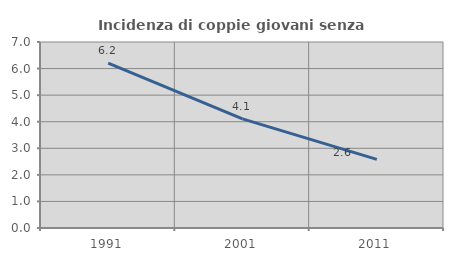
| Category | Incidenza di coppie giovani senza figli |
|---|---|
| 1991.0 | 6.208 |
| 2001.0 | 4.105 |
| 2011.0 | 2.582 |